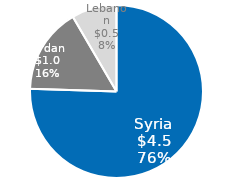
| Category | HRP |
|---|---|
| Syria | 4475000.25 |
| Jordan | 952961.88 |
| Lebanon | 499177 |